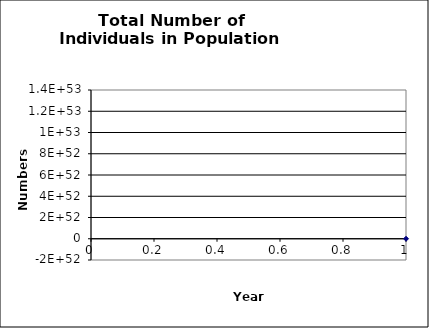
| Category | Series 0 |
|---|---|
| 0 | 10 |
| 1 | 110 |
| 2 | 1210 |
| 3 | 13310 |
| 4 | 146410 |
| 5 | 1610510 |
| 6 | 17715610 |
| 7 | 194871710 |
| 8 | 2143588810 |
| 9 | 23579476910 |
| 10 | 259374246010 |
| 11 | 2853116706110 |
| 12 | 31384283767210 |
| 13 | 345227121439310 |
| 14 | 3797498335832410 |
| 15 | 41772481694156504 |
| 16 | 459497298635721536 |
| 17 | 5054470284992936960 |
| 18 | 55599173134922301440 |
| 19 | 611590904484145397760 |
| 20 | 6727499949325598851072 |
| 21 | 74002499442581599944704 |
| 22 | 814027493868397515505664 |
| 23 | 8954302432552372804780032 |
| 24 | 98497326758076090115162112 |
| 25 | 1083470594338837008446652416 |
| 26 | 11918176537727206405718409216 |
| 27 | 131099941914999257268762968064 |
| 28 | 1442099361064991829956392648704 |
| 29 | 15863092971714907596245528739840 |
| 30 | 174494022688863999321299511934976 |
| 31 | 1919434249577503992534294631284736 |
| 32 | 21113776745352542764955736337285120 |
| 33 | 232251544198877924297652915436257280 |
| 34 | 2554766986187657573102551691408965632 |
| 35 | 28102436848064230942944827170676015104 |
| 36 | 309126805328706597040790893313178730496 |
| 37 | 3400394858615772340775108648701995778048 |
| 38 | 37404343444773493935137465713778191499264 |
| 39 | 411447777892508428450808844393043407667200 |
| 40 | 4525925556817593331928916931013614933901312 |
| 41 | 49785181124993523556367988027699077025103872 |
| 42 | 547636992374928739313007239738605448890155008 |
| 43 | 6024006916124216290899404665653335124879605760 |
| 44 | 66264076077366365255736848811663269909940404224 |
| 45 | 728904836851030068519129346057472028877472661504 |
| 46 | 8017953205361330915969699635845555709230209564672 |
| 47 | 88197485258974638777592481360594205668908222906368 |
| 48 | 970172337848721130399454465663088832967917036371968 |
| 49 | 10671895716335933763621994907209850066454147680436224 |
| 50 | 117390852879695247473738019850822638462468539438596096 |